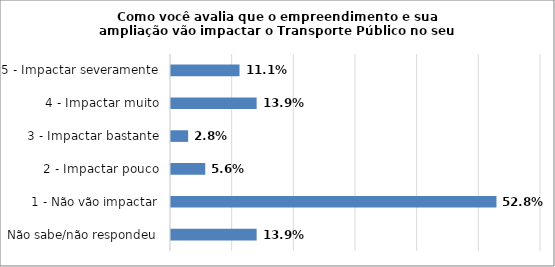
| Category | Series 0 |
|---|---|
| Não sabe/não respondeu | 0.139 |
| 1 - Não vão impactar | 0.528 |
| 2 - Impactar pouco | 0.056 |
| 3 - Impactar bastante | 0.028 |
| 4 - Impactar muito | 0.139 |
| 5 - Impactar severamente | 0.111 |